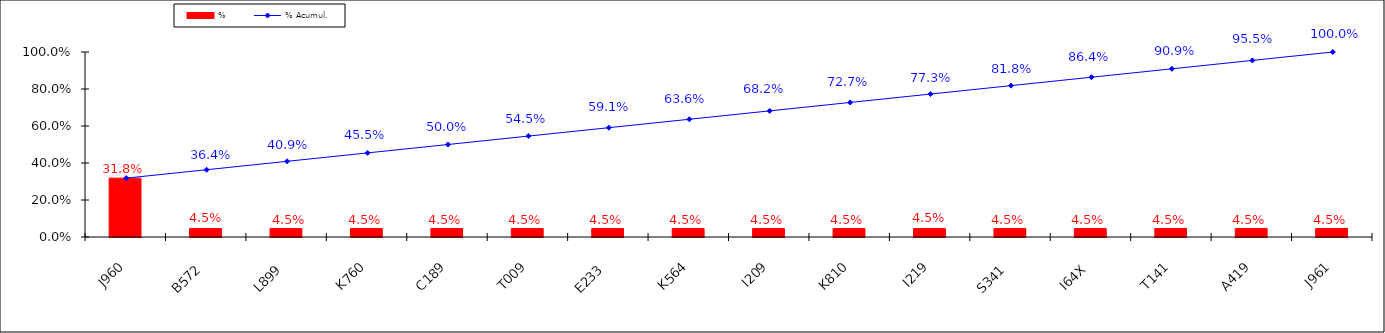
| Category | % |
|---|---|
| J960 | 0.318 |
| B572 | 0.045 |
| L899 | 0.045 |
| K760 | 0.045 |
| C189 | 0.045 |
| T009 | 0.045 |
| E233 | 0.045 |
| K564 | 0.045 |
| I209 | 0.045 |
| K810 | 0.045 |
| I219 | 0.045 |
| S341 | 0.045 |
| I64X | 0.045 |
| T141 | 0.045 |
| A419 | 0.045 |
| J961 | 0.045 |